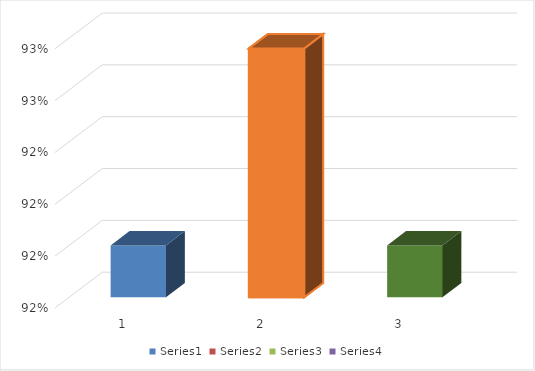
| Category | Series 0 | Series 1 | Series 2 | Series 3 |
|---|---|---|---|---|
| 0 | 0.92 |  |  |  |
| 1 | 0.928 |  |  |  |
| 2 | 0.92 |  |  |  |